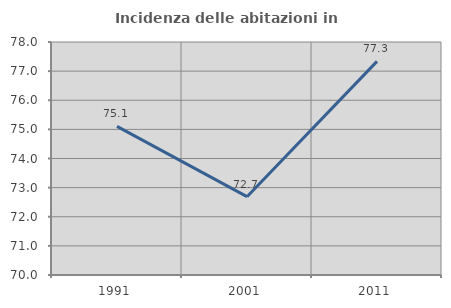
| Category | Incidenza delle abitazioni in proprietà  |
|---|---|
| 1991.0 | 75.105 |
| 2001.0 | 72.689 |
| 2011.0 | 77.335 |